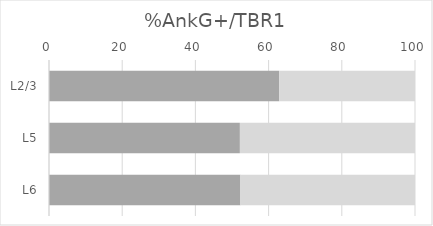
| Category | Series 0 | Series 1 |
|---|---|---|
| L2/3 | 62.882 | 37.118 |
| L5 | 52.157 | 47.843 |
| L6 | 52.302 | 47.698 |